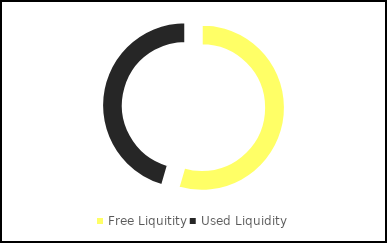
| Category | Series 0 |
|---|---|
| Free Liquitity | 0.027 |
| Used Liquidity | 0.023 |